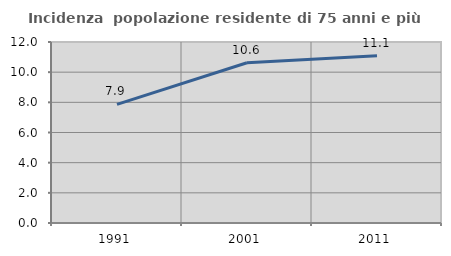
| Category | Incidenza  popolazione residente di 75 anni e più |
|---|---|
| 1991.0 | 7.864 |
| 2001.0 | 10.623 |
| 2011.0 | 11.088 |